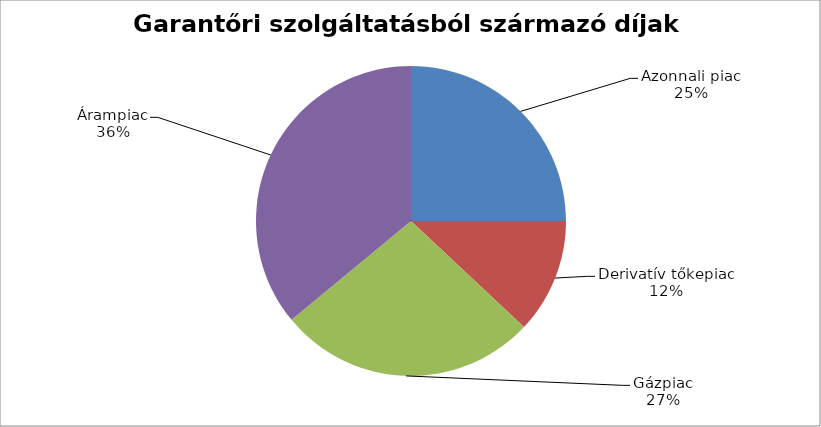
| Category | Series 0 |
|---|---|
| Azonnali piac | 0.25 |
| Derivatív tőkepiac | 0.12 |
| Gázpiac | 0.27 |
| Árampiac | 0.36 |